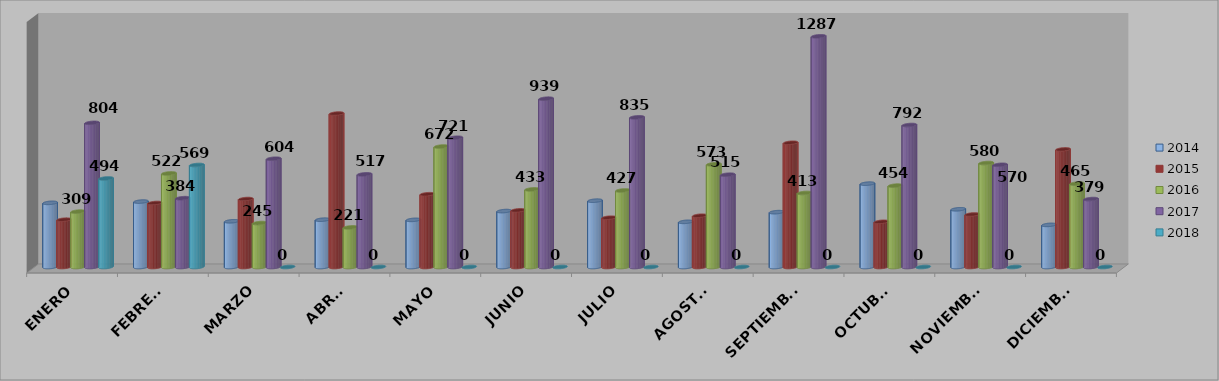
| Category | 2014 | 2015 | 2016 | 2017 | 2018 |
|---|---|---|---|---|---|
| ENERO | 358 | 264 | 309 | 804 | 494 |
| FEBRERO | 365 | 357 | 522 | 384 | 569 |
| MARZO | 255 | 379 | 245 | 604 | 0 |
| ABRIL | 264 | 856 | 221 | 517 | 0 |
| MAYO | 263 | 406 | 672 | 721 | 0 |
| JUNIO | 312 | 316 | 433 | 939 | 0 |
| JULIO | 370 | 275 | 427 | 835 | 0 |
| AGOSTO | 252 | 286 | 573 | 515 | 0 |
| SEPTIEMBRE | 306 | 693 | 413 | 1287 | 0 |
| OCTUBRE | 465 | 252 | 454 | 792 | 0 |
| NOVIEMBRE | 322 | 293 | 580 | 570 | 0 |
| DICIEMBRE | 235 | 656 | 465 | 379 | 0 |